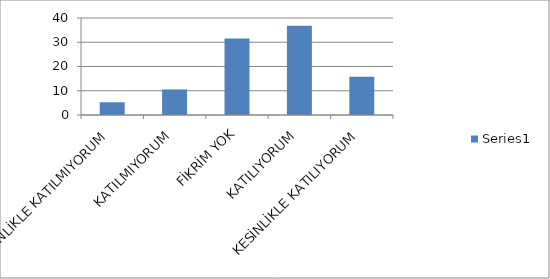
| Category | Series 0 |
|---|---|
| KESİNLİKLE KATILMIYORUM | 5.26 |
| KATILMIYORUM | 10.53 |
| FİKRİM YOK | 31.58 |
| KATILIYORUM | 36.84 |
| KESİNLİKLE KATILIYORUM | 15.79 |